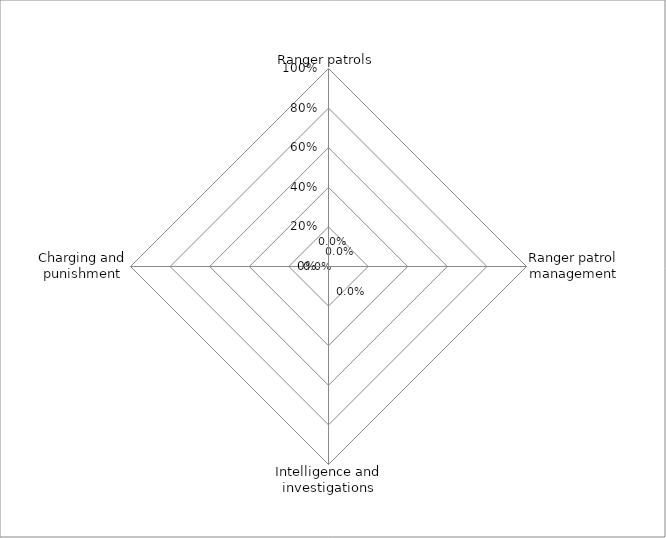
| Category | Series 0 |
|---|---|
| Ranger patrols | 0 |
| Ranger patrol management | 0 |
| Intelligence and investigations | 0 |
| Charging and punishment | 0 |